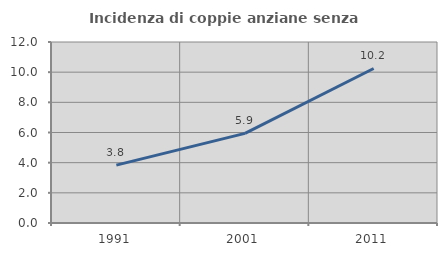
| Category | Incidenza di coppie anziane senza figli  |
|---|---|
| 1991.0 | 3.835 |
| 2001.0 | 5.945 |
| 2011.0 | 10.244 |